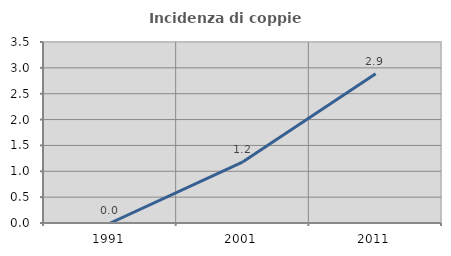
| Category | Incidenza di coppie miste |
|---|---|
| 1991.0 | 0 |
| 2001.0 | 1.183 |
| 2011.0 | 2.887 |